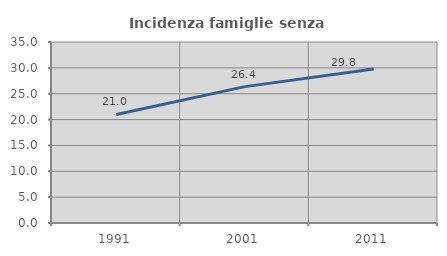
| Category | Incidenza famiglie senza nuclei |
|---|---|
| 1991.0 | 20.985 |
| 2001.0 | 26.369 |
| 2011.0 | 29.777 |